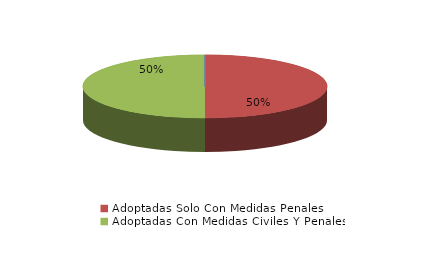
| Category | Series 0 |
|---|---|
| Denegadas | 0 |
| Adoptadas Solo Con Medidas Penales | 2 |
| Adoptadas Con Medidas Civiles Y Penales | 2 |
| Adoptadas Con Medidas Solo Civiles | 0 |